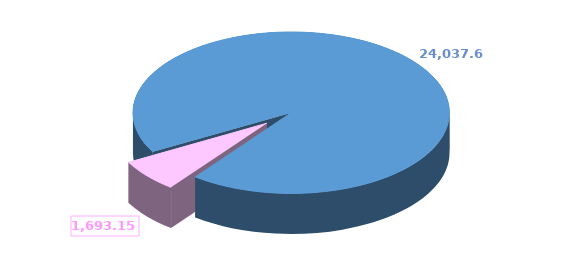
| Category | Series 0 |
|---|---|
| 0 | 24037.601 |
| 1 | 1693.152 |